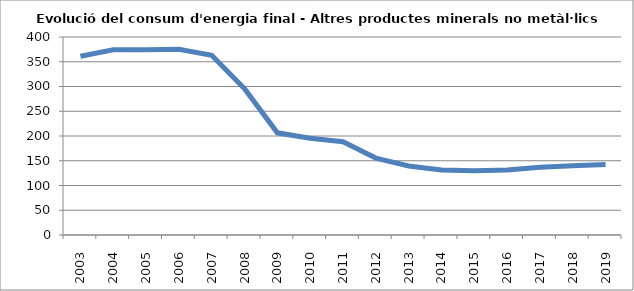
| Category | 361,2 |
|---|---|
| 2003.0 | 361.2 |
| 2004.0 | 374.08 |
| 2005.0 | 374.05 |
| 2006.0 | 375.16 |
| 2007.0 | 363.08 |
| 2008.0 | 295.52 |
| 2009.0 | 206.39 |
| 2010.0 | 195.31 |
| 2011.0 | 188.41 |
| 2012.0 | 155.41 |
| 2013.0 | 139.55 |
| 2014.0 | 131.39 |
| 2015.0 | 129.68 |
| 2016.0 | 131.41 |
| 2017.0 | 136.69 |
| 2018.0 | 139.69 |
| 2019.0 | 142.19 |